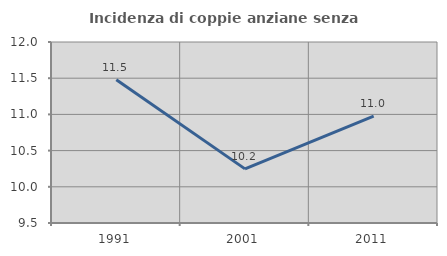
| Category | Incidenza di coppie anziane senza figli  |
|---|---|
| 1991.0 | 11.478 |
| 2001.0 | 10.247 |
| 2011.0 | 10.976 |